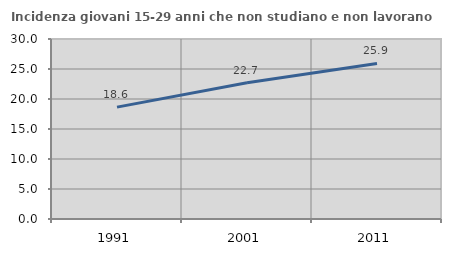
| Category | Incidenza giovani 15-29 anni che non studiano e non lavorano  |
|---|---|
| 1991.0 | 18.644 |
| 2001.0 | 22.709 |
| 2011.0 | 25.926 |